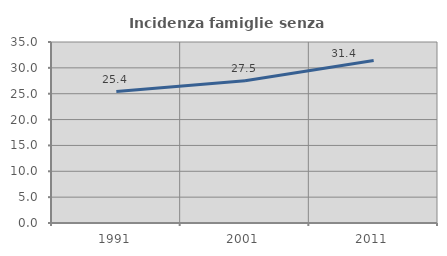
| Category | Incidenza famiglie senza nuclei |
|---|---|
| 1991.0 | 25.407 |
| 2001.0 | 27.496 |
| 2011.0 | 31.422 |